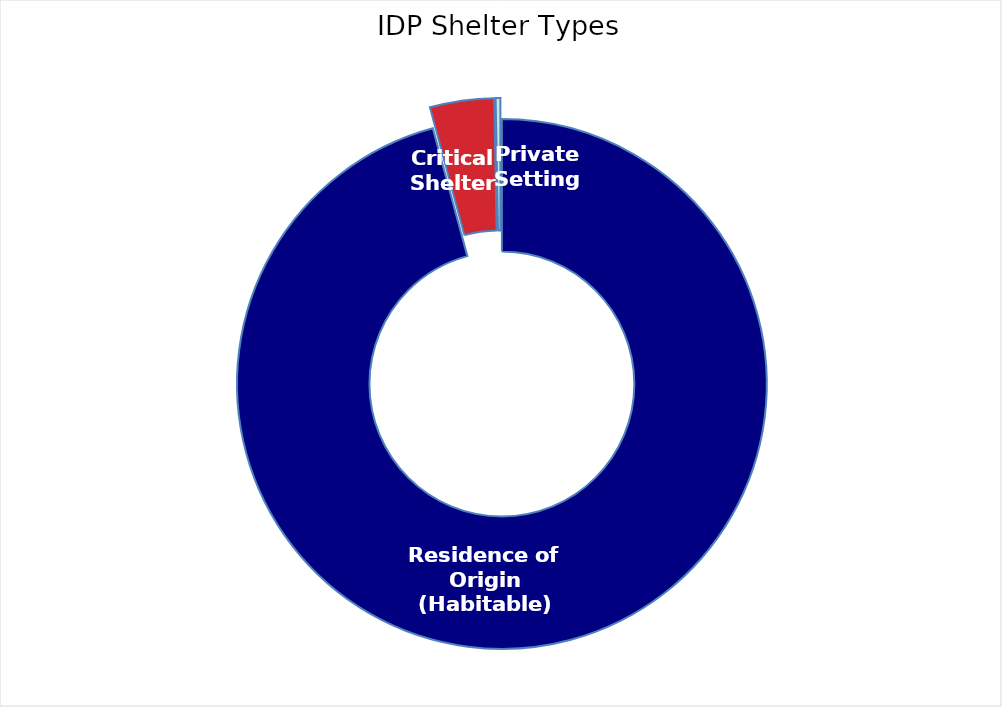
| Category | Individuals |
|---|---|
| Residence of Origin (Habitable) | 4751370 |
| Critical Shelter | 194082 |
| Private Setting | 14262 |